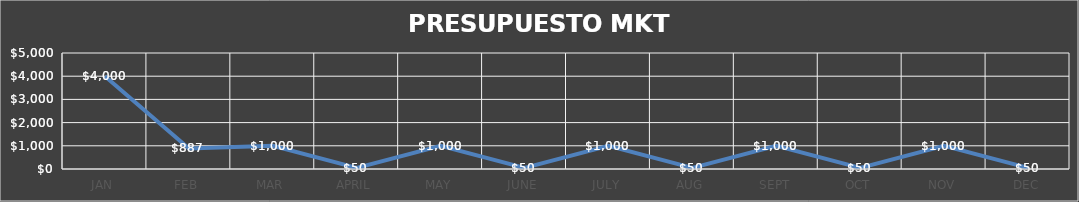
| Category | Series 0 |
|---|---|
| JAN | 4000 |
| FEB | 887 |
| MAR | 1000 |
| APRIL | 50 |
| MAY | 1000 |
| JUNE | 50 |
| JULY | 1000 |
| AUG | 50 |
| SEPT | 1000 |
| OCT | 50 |
| NOV | 1000 |
| DEC | 50 |